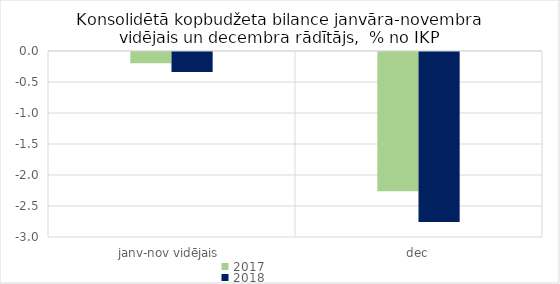
| Category | 2017 | 2018 |
|---|---|---|
| janv-nov vidējais | -0.182 | -0.323 |
| dec | -2.248 | -2.743 |